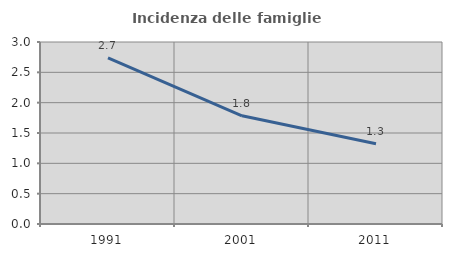
| Category | Incidenza delle famiglie numerose |
|---|---|
| 1991.0 | 2.74 |
| 2001.0 | 1.783 |
| 2011.0 | 1.324 |